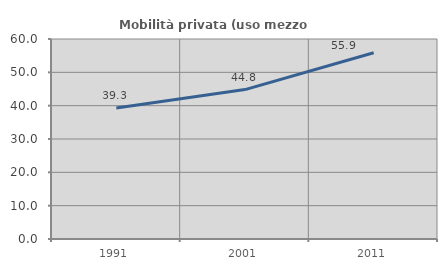
| Category | Mobilità privata (uso mezzo privato) |
|---|---|
| 1991.0 | 39.286 |
| 2001.0 | 44.828 |
| 2011.0 | 55.882 |